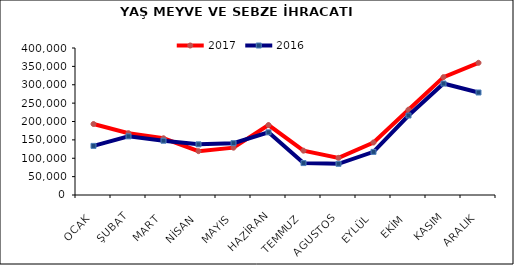
| Category | 2017 | 2016 |
|---|---|---|
| OCAK | 193163.392 | 133664.183 |
| ŞUBAT | 168162.278 | 159610.863 |
| MART | 154358.604 | 147688.555 |
| NİSAN | 119339.193 | 137864.256 |
| MAYIS | 128821.773 | 141054.256 |
| HAZİRAN | 190398.624 | 170561.31 |
| TEMMUZ | 120608.264 | 86823.6 |
| AGUSTOS | 101085.524 | 84936.203 |
| EYLÜL | 142896.146 | 117323.376 |
| EKİM | 232112.15 | 216306.399 |
| KASIM | 320718.151 | 303272.157 |
| ARALIK | 359727.284 | 278887.073 |